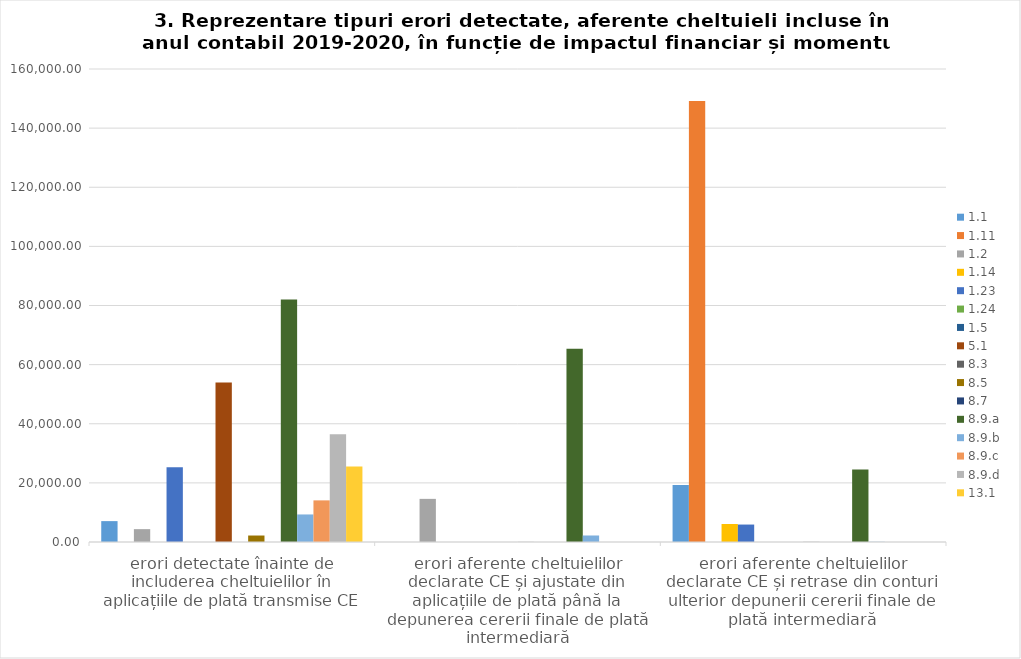
| Category | 1.1 | 1.11 | 1.2 | 1.14 | 1.23 | 1.24 | 1.5 | 5.1 | 8.3 | 8.5 | 8.7 | 8.9.a  | 8.9.b | 8.9.c  | 8.9.d | 13.1 |
|---|---|---|---|---|---|---|---|---|---|---|---|---|---|---|---|---|
| erori detectate înainte de includerea cheltuielilor în aplicațiile de plată transmise CE | 7065.114 | 0 | 4349.55 | 0 | 25315.184 | 0 | 0 | 53951.486 | 0 | 2191.212 | 0 | 82029.587 | 9316.339 | 14079.317 | 36440.996 | 25544.185 |
| erori aferente cheltuielilor declarate CE și ajustate din aplicațiile de plată până la depunerea cererii finale de plată intermediară | 0 | 0 | 14588.35 | 0 | 0 | 0 | 0 | 0 | 24.1 | 0 | 0 | 65393.01 | 2200.93 | 0 | 0 | 0 |
| erori aferente cheltuielilor declarate CE și retrase din conturi ulterior depunerii cererii finale de plată intermediară | 19305.71 | 149167.54 | 0 | 6097.55 | 5902.89 | 0 | 0 | 0 | 39.86 | 0 | 0 | 24507.09 | 71.05 | 0 | 0 | 0 |